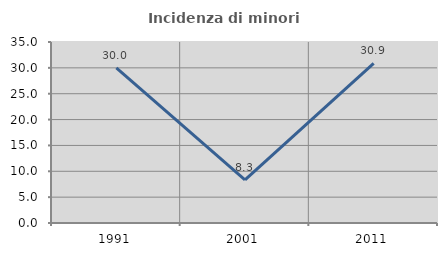
| Category | Incidenza di minori stranieri |
|---|---|
| 1991.0 | 30 |
| 2001.0 | 8.333 |
| 2011.0 | 30.882 |